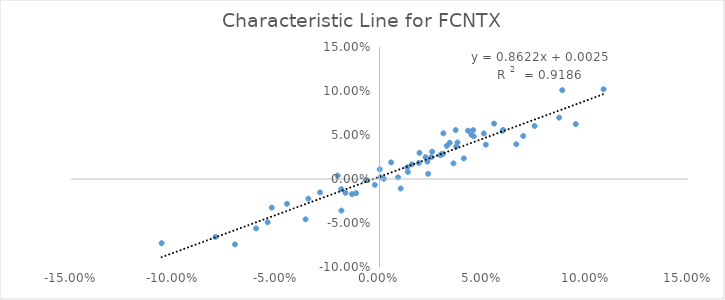
| Category | CY |
|---|---|
| -0.1059327 | -0.073 |
| 0.08737310000000001 | 0.07 |
| 0.095444 | 0.062 |
| 0.0557042 | 0.063 |
| 0.0020888 | 0 |
| 0.07540079999999999 | 0.06 |
| 0.035958000000000004 | 0.018 |
| 0.0370559 | 0.056 |
| -0.018584 | -0.012 |
| 0.0597727 | 0.055 |
| 0.0194468 | 0.03 |
| -0.035959500000000005 | -0.046 |
| 0.0308422 | 0.028 |
| 0.0600575 | 0.056 |
| 0.015744400000000002 | 0.017 |
| -0.07970780000000001 | -0.066 |
| -0.0523916 | -0.032 |
| 0.0698836 | 0.049 |
| -0.044996799999999997 | -0.028 |
| 0.0888592 | 0.101 |
| 0.0379096 | 0.042 |
| 0.0001036 | 0.011 |
| 0.0665253 | 0.039 |
| 0.0236714 | 0.006 |
| 0.0341335 | 0.041 |
| 0.0004617 | 0.002 |
| 0.029523 | 0.027 |
| -0.0113769 | -0.016 |
| -0.0165366 | -0.016 |
| -0.0203741 | 0.004 |
| -0.0543726 | -0.049 |
| -0.070295 | -0.074 |
| 0.108948 | 0.102 |
| -0.0022722000000000003 | -0.007 |
| 0.0102924 | -0.011 |
| 0.0446856 | 0.05 |
| 0.0430358 | 0.055 |
| 0.032705899999999996 | 0.038 |
| -0.006343499999999999 | -0.001 |
| -0.0599879 | -0.056 |
| 0.040982399999999995 | 0.023 |
| 0.0138008 | 0.008 |
| 0.0223781 | 0.025 |
| 0.0255778 | 0.031 |
| -0.018497200000000002 | -0.036 |
| 0.0056457 | 0.019 |
| 0.0090206 | 0.002 |
| 0.0516966 | 0.039 |
| 0.013493999999999999 | 0.013 |
| 0.0372938 | 0.037 |
| 0.0191384 | 0.018 |
| 0.0232838 | 0.02 |
| -0.0133928 | -0.017 |
| 0.0507292 | 0.052 |
| -0.028890600000000002 | -0.015 |
| 0.031069100000000002 | 0.052 |
| 0.0458378 | 0.049 |
| 0.030313500000000004 | 0.029 |
| 0.025194200000000003 | 0.025 |
| -0.0345952 | -0.022 |
| 0.045521200000000005 | 0.056 |